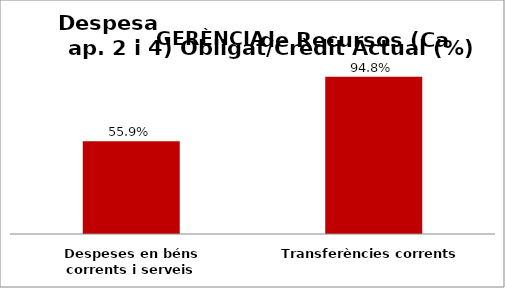
| Category | Series 0 |
|---|---|
| Despeses en béns corrents i serveis | 0.559 |
| Transferències corrents | 0.948 |